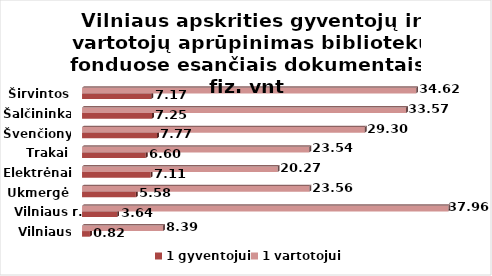
| Category | 1 gyventojui | 1 vartotojui |
|---|---|---|
| Vilniaus m. | 0.82 | 8.39 |
| Vilniaus r. | 3.64 | 37.96 |
| Ukmergė | 5.58 | 23.56 |
| Elektrėnai | 7.11 | 20.27 |
| Trakai | 6.6 | 23.54 |
| Švenčionys | 7.77 | 29.3 |
| Šalčininkai | 7.25 | 33.57 |
| Širvintos | 7.17 | 34.62 |